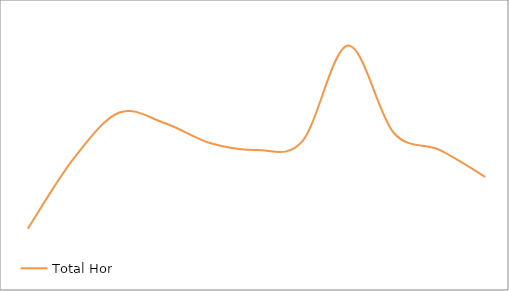
| Category | Total Horas |
|---|---|
| 43 | 20.5 |
| 44 | 90.8 |
| 45 | 137 |
| 46 | 126.25 |
| 47 | 106.15 |
| 48 | 99.5 |
| 49 | 108 |
| 50 | 204.25 |
| 51 | 116.75 |
| 52 | 99.5 |
| 53 | 72.5 |